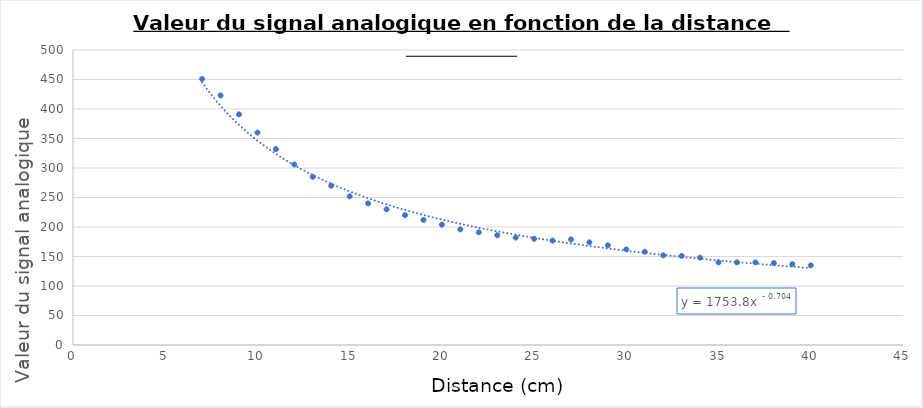
| Category | Series 0 |
|---|---|
| 40.0 | 135 |
| 39.0 | 137 |
| 38.0 | 139 |
| 37.0 | 140 |
| 36.0 | 140 |
| 35.0 | 140 |
| 34.0 | 148 |
| 33.0 | 151 |
| 32.0 | 152 |
| 31.0 | 158 |
| 30.0 | 162 |
| 29.0 | 169 |
| 28.0 | 174 |
| 27.0 | 179 |
| 26.0 | 177 |
| 25.0 | 180 |
| 24.0 | 182 |
| 23.0 | 186 |
| 22.0 | 191 |
| 21.0 | 196 |
| 20.0 | 204 |
| 19.0 | 212 |
| 18.0 | 220 |
| 17.0 | 230 |
| 16.0 | 240 |
| 15.0 | 252 |
| 14.0 | 270 |
| 13.0 | 285 |
| 12.0 | 306 |
| 11.0 | 332 |
| 10.0 | 360 |
| 9.0 | 391 |
| 8.0 | 423 |
| 7.0 | 451 |